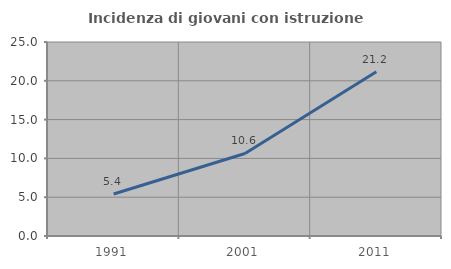
| Category | Incidenza di giovani con istruzione universitaria |
|---|---|
| 1991.0 | 5.414 |
| 2001.0 | 10.635 |
| 2011.0 | 21.157 |